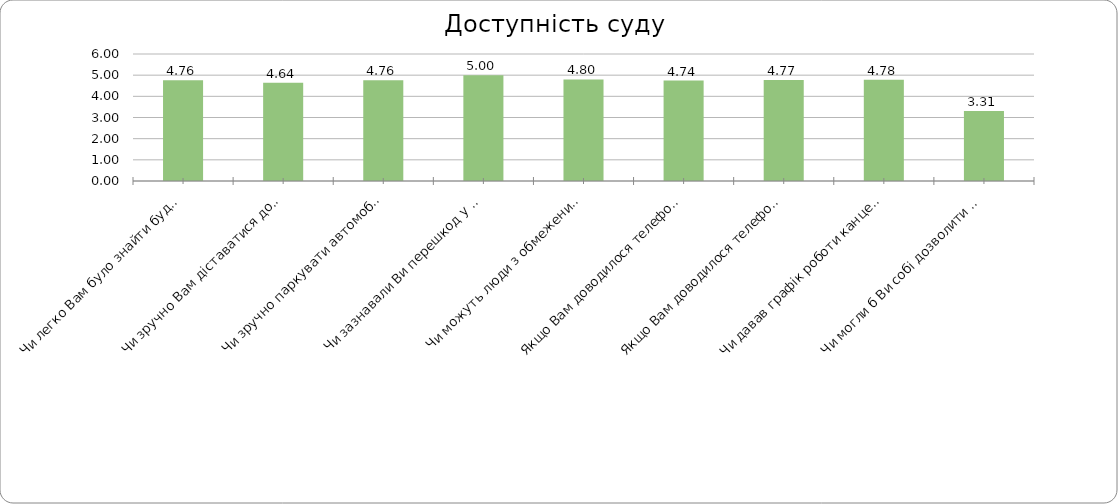
| Category | Series 0 |
|---|---|
| Чи легко Вам було знайти будівлю суду? | 4.76 |
| Чи зручно Вам діставатися до будівлі суду громадським транспортом? | 4.639 |
| Чи зручно паркувати автомобіль (достатньо паркувальних місць) біля будівлі суду? | 4.762 |
| Чи зазнавали Ви перешкод у доступі до приміщень суду через охорону? | 5 |
| Чи можуть люди з обмеженими можливостями безперешкодно потрапити до приміщення суду і користуватися послугами суду? | 4.796 |
| Якщо Вам доводилося телефонувати до суду, чи завжди вдавалось додзвонитися? | 4.744 |
| Якщо Вам доводилося телефонувати до суду, чи завжди вдавалось отримати потрібну інформацію? | 4.769 |
| Чи давав графік роботи канцелярії суду можливість вчасно та безперешкодно вирішувати Ваші справи у суді | 4.778 |
| Чи могли б Ви собі дозволити витрати на послуги адвоката у разі необхідності? | 3.31 |